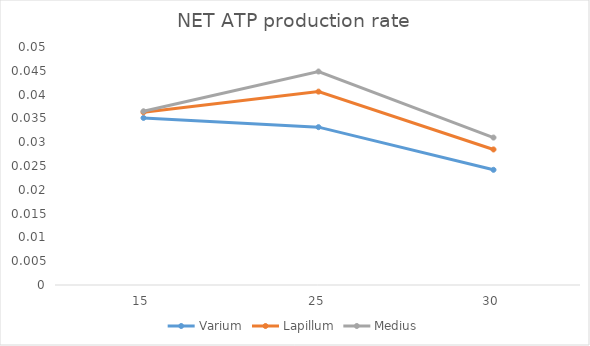
| Category | Varium | Lapillum | Medius |
|---|---|---|---|
| 15.0 | 0.035 | 0.036 | 0.036 |
| 25.0 | 0.033 | 0.041 | 0.045 |
| 30.0 | 0.024 | 0.028 | 0.031 |